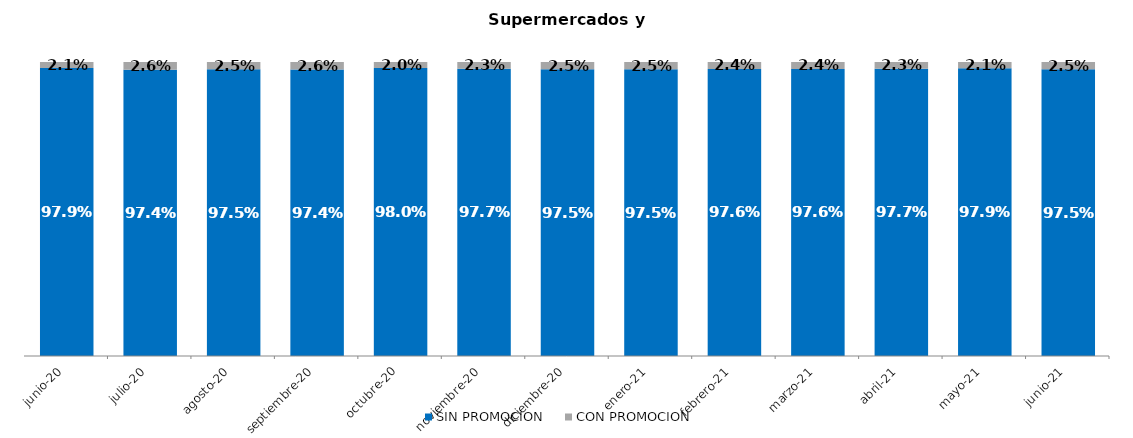
| Category | SIN PROMOCION   | CON PROMOCION   |
|---|---|---|
| 2020-06-01 | 0.979 | 0.021 |
| 2020-07-01 | 0.974 | 0.026 |
| 2020-08-01 | 0.975 | 0.025 |
| 2020-09-01 | 0.974 | 0.026 |
| 2020-10-01 | 0.98 | 0.02 |
| 2020-11-01 | 0.977 | 0.023 |
| 2020-12-01 | 0.975 | 0.025 |
| 2021-01-01 | 0.975 | 0.025 |
| 2021-02-01 | 0.976 | 0.024 |
| 2021-03-01 | 0.976 | 0.024 |
| 2021-04-01 | 0.977 | 0.023 |
| 2021-05-01 | 0.979 | 0.021 |
| 2021-06-01 | 0.975 | 0.025 |